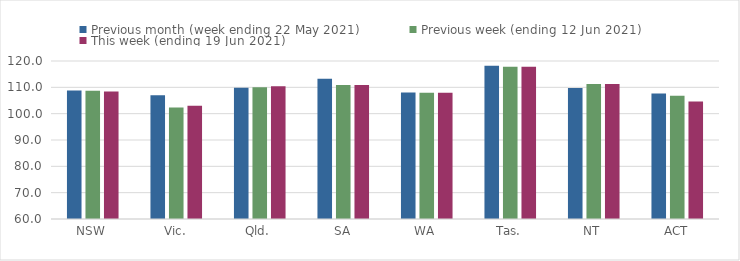
| Category | Previous month (week ending 22 May 2021) | Previous week (ending 12 Jun 2021) | This week (ending 19 Jun 2021) |
|---|---|---|---|
| NSW | 108.76 | 108.73 | 108.4 |
| Vic. | 107.04 | 102.32 | 102.97 |
| Qld. | 109.84 | 110.03 | 110.38 |
| SA | 113.22 | 110.85 | 110.85 |
| WA | 108 | 107.97 | 107.97 |
| Tas. | 118.17 | 117.81 | 117.81 |
| NT | 109.7 | 111.22 | 111.22 |
| ACT | 107.68 | 106.77 | 104.6 |